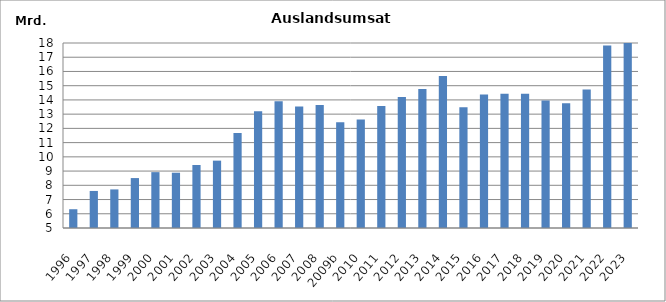
| Category | Series 0 |
|---|---|
| 1996 | 6319142 |
| 1997 | 7603819 |
| 1998 | 7711587 |
| 1999 | 8508603 |
| 2000 | 8925754 |
| 2001 | 8885463 |
| 2002 | 9428713 |
| 2003 | 9733339 |
| 2004 | 11680546 |
| 2005 | 13208153 |
| 2006 | 13901521 |
| 2007 | 13537187 |
| 2008 | 13649884 |
| 2009b | 12432618 |
| 2010 | 12628416.402 |
| 2011 | 13577795 |
| 2012 | 14199097 |
| 2013 | 14765099 |
| 2014 | 15677925.464 |
| 2015 | 13486756 |
| 2016 | 14385658 |
| 2017 | 14436506 |
| 2018 | 14434940 |
| 2019 | 13955245 |
| 2020 | 13761427 |
| 2021 | 14734266.581 |
| 2022 | 17818242.472 |
| 2023 | 18050438.838 |